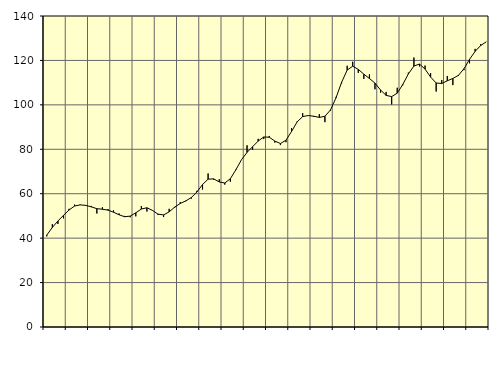
| Category | Piggar | Series 1 |
|---|---|---|
| nan | 40.8 | 41.38 |
| 1.0 | 46.3 | 44.83 |
| 1.0 | 46.4 | 47.72 |
| 1.0 | 48.9 | 50.26 |
| nan | 53.2 | 52.66 |
| 2.0 | 55.1 | 54.45 |
| 2.0 | 55.1 | 54.98 |
| 2.0 | 54.6 | 54.75 |
| nan | 54.5 | 54.08 |
| 3.0 | 51.1 | 53.27 |
| 3.0 | 53.9 | 53.01 |
| 3.0 | 53.1 | 52.62 |
| nan | 52.5 | 51.67 |
| 4.0 | 51.1 | 50.5 |
| 4.0 | 50 | 49.64 |
| 4.0 | 49.4 | 49.92 |
| nan | 49.8 | 51.4 |
| 5.0 | 54.4 | 53.1 |
| 5.0 | 52 | 53.68 |
| 5.0 | 52.4 | 52.49 |
| nan | 50.4 | 50.8 |
| 6.0 | 49.5 | 50.46 |
| 6.0 | 53.2 | 51.84 |
| 6.0 | 53.7 | 53.98 |
| nan | 56.2 | 55.62 |
| 7.0 | 56.6 | 56.79 |
| 7.0 | 57.8 | 58.3 |
| 7.0 | 61.3 | 60.81 |
| nan | 61.9 | 64.13 |
| 8.0 | 69.1 | 66.55 |
| 8.0 | 66.3 | 66.69 |
| 8.0 | 66.5 | 65.3 |
| nan | 64.1 | 64.83 |
| 9.0 | 65.4 | 66.75 |
| 9.0 | 71 | 70.8 |
| 9.0 | 75.3 | 75.3 |
| nan | 81.8 | 78.6 |
| 10.0 | 79.7 | 81.15 |
| 10.0 | 84.7 | 83.69 |
| 10.0 | 84.6 | 85.54 |
| nan | 86 | 85.43 |
| 11.0 | 83 | 83.69 |
| 11.0 | 81.9 | 82.6 |
| 11.0 | 83.2 | 84.07 |
| nan | 89.5 | 88.01 |
| 12.0 | 92.5 | 92.3 |
| 12.0 | 96.3 | 94.72 |
| 12.0 | 95.3 | 95.19 |
| nan | 94.6 | 94.88 |
| 13.0 | 95.8 | 94.34 |
| 13.0 | 92.2 | 94.86 |
| 13.0 | 97.4 | 97.69 |
| nan | 103.6 | 103.2 |
| 14.0 | 109.7 | 110.14 |
| 14.0 | 117.6 | 115.66 |
| 14.0 | 119.4 | 117.4 |
| nan | 114.4 | 115.98 |
| 15.0 | 111.7 | 113.8 |
| 15.0 | 113.7 | 111.88 |
| 15.0 | 107 | 109.78 |
| nan | 105.5 | 106.7 |
| 16.0 | 105.8 | 104.26 |
| 16.0 | 100.2 | 103.72 |
| 16.0 | 107.7 | 105.26 |
| nan | 108.8 | 109.16 |
| 17.0 | 114.5 | 113.93 |
| 17.0 | 121.3 | 117.47 |
| 17.0 | 117.3 | 118.36 |
| nan | 117.7 | 116.12 |
| 18.0 | 114.3 | 112.51 |
| 18.0 | 106 | 109.84 |
| 18.0 | 111.2 | 109.62 |
| nan | 113 | 110.83 |
| 19.0 | 108.9 | 111.9 |
| 19.0 | 113 | 113.27 |
| 19.0 | 115.6 | 116.26 |
| nan | 118.7 | 120.48 |
| 20.0 | 125.2 | 124.06 |
| 20.0 | 127.3 | 126.71 |
| 20.0 | 128.4 | 128.34 |